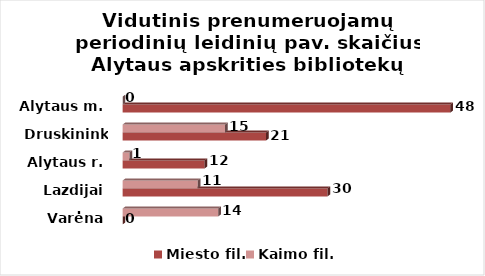
| Category | Miesto fil. | Kaimo fil. |
|---|---|---|
| Varėna | 0 | 14 |
| Lazdijai | 30 | 11 |
| Alytaus r. | 12 | 1 |
| Druskininkai | 21 | 15 |
| Alytaus m. | 48 | 0 |